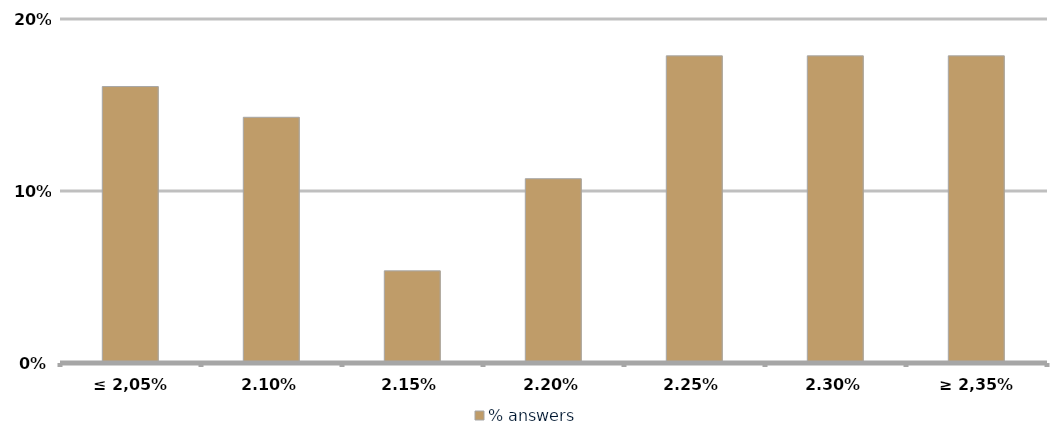
| Category | % answers |
|---|---|
| ≤ 2,05% | 0.161 |
| 2,10% | 0.143 |
| 2,15% | 0.054 |
| 2,20% | 0.107 |
| 2,25% | 0.179 |
| 2,30% | 0.179 |
| ≥ 2,35% | 0.179 |